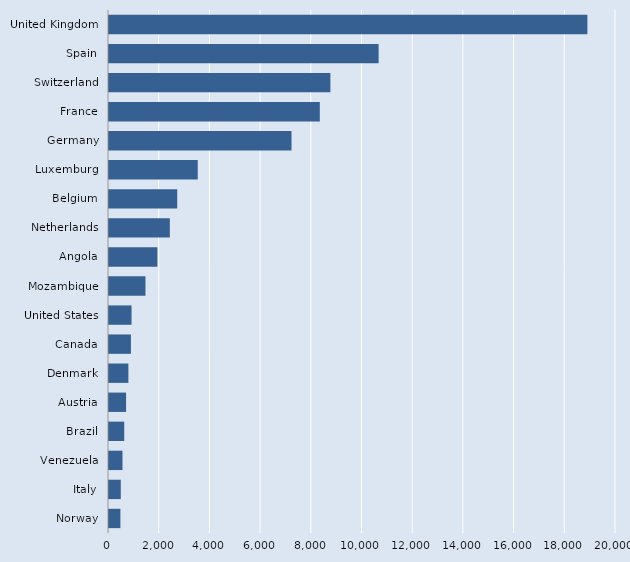
| Category | Series 0 |
|---|---|
| Norway | 450 |
| Italy | 465 |
| Venezuela | 532 |
| Brazil | 601 |
| Austria | 674 |
| Denmark | 765 |
| Canada | 865 |
| United States | 889 |
| Mozambique | 1439 |
| Angola | 1910 |
| Netherlands | 2400 |
| Belgium | 2691 |
| Luxemburg | 3501 |
| Germany | 7200 |
| France | 8316 |
| Switzerland | 8733 |
| Spain | 10636 |
| United Kingdom | 18871 |